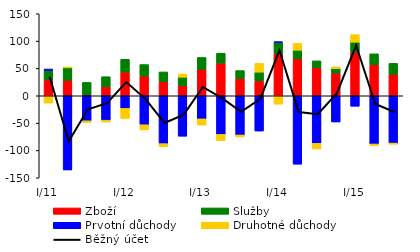
| Category | Zboží | Služby | Prvotní důchody | Druhotné důchody |
|---|---|---|---|---|
| I/11 | 28.994 | 17.24 | 2.716 | -13.37 |
| II | 28.218 | 22.874 | -135.675 | 1.741 |
| III | 1.774 | 22.739 | -45.729 | -3.187 |
| IV | 16.492 | 18.43 | -44.657 | -3.399 |
| I/12 | 43.281 | 23.478 | -23.083 | -18.258 |
| II | 36.152 | 20.972 | -52.981 | -9.36 |
| III | 25.681 | 17.923 | -87.565 | -5.364 |
| IV | 18.683 | 15.252 | -73.899 | 5.772 |
| I/13 | 48.355 | 21.702 | -42.281 | -11.28 |
| II | 59.692 | 18.186 | -70.624 | -11.218 |
| III | 31.672 | 14.458 | -71.638 | -3.56 |
| IV | 27.254 | 16.013 | -64.475 | 15.96 |
| I/14 | 77.394 | 20.418 | 1.008 | -15.254 |
| II | 68.219 | 15.152 | -125.09 | 12.495 |
| III | 51.694 | 12.235 | -87.004 | -10.21 |
| IV | 41.587 | 8.072 | -47.876 | 3.26 |
| I/15 | 79.393 | 18.663 | -19.091 | 13.764 |
| II | 56.811 | 19.952 | -88.179 | -3.184 |
| III | 39.418 | 19.868 | -86.57 | -2.002 |